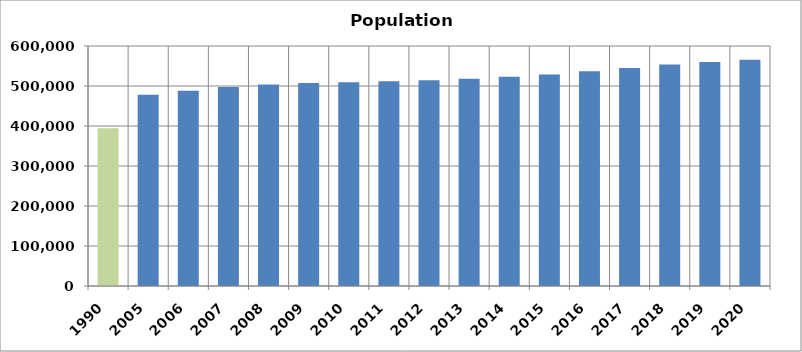
| Category | Population Estimates |
|---|---|
| 1990.0 | 394313.469 |
| 2005.0 | 478344.901 |
| 2006.0 | 488261.751 |
| 2007.0 | 497399.905 |
| 2008.0 | 503546.994 |
| 2009.0 | 507649.096 |
| 2010.0 | 509398.13 |
| 2011.0 | 511666.294 |
| 2012.0 | 514677.777 |
| 2013.0 | 518257.514 |
| 2014.0 | 523052.801 |
| 2015.0 | 528738.218 |
| 2016.0 | 536834.696 |
| 2017.0 | 545175.433 |
| 2018.0 | 553723.448 |
| 2019.0 | 560109.516 |
| 2020.0 | 565818.246 |